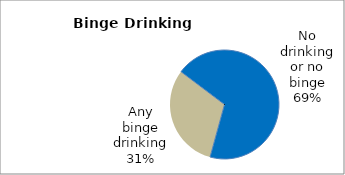
| Category | Series 0 |
|---|---|
| No drinking or no binge | 68.991 |
| Any binge drinking | 31.009 |